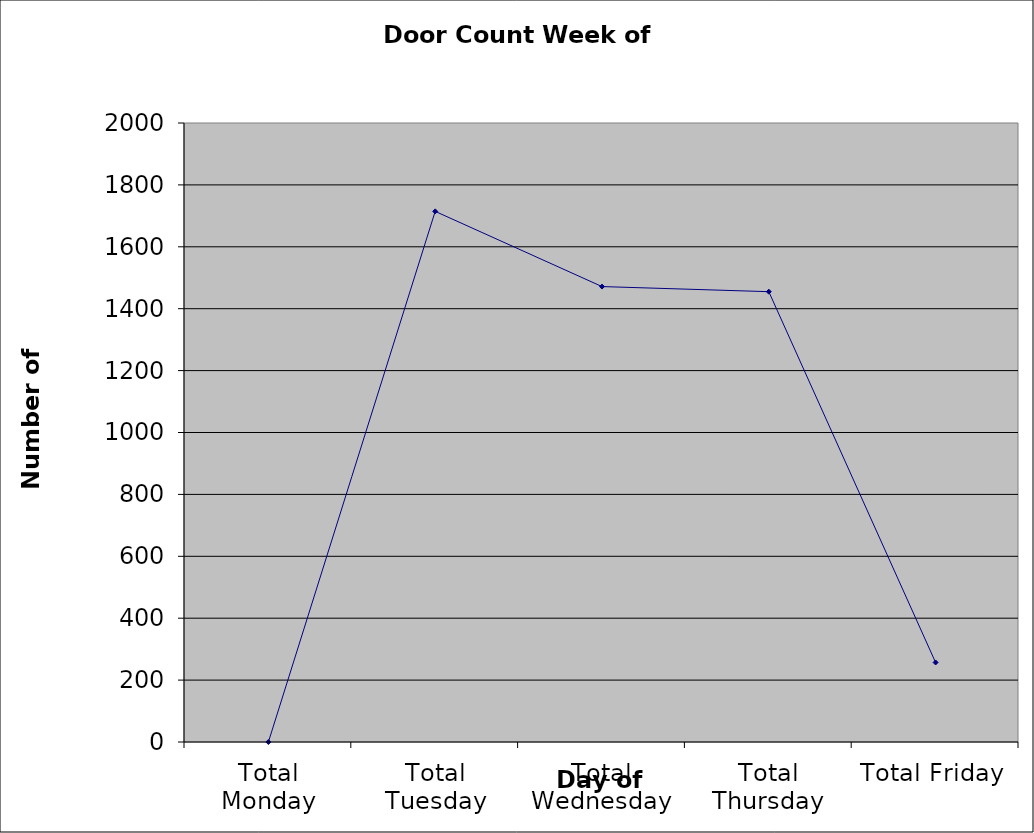
| Category | Series 0 |
|---|---|
| Total Monday | 0 |
| Total Tuesday | 1714.5 |
| Total Wednesday | 1471.5 |
| Total Thursday | 1455 |
| Total Friday | 257 |